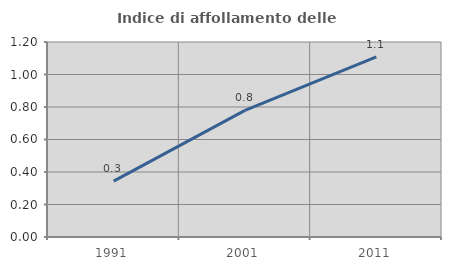
| Category | Indice di affollamento delle abitazioni  |
|---|---|
| 1991.0 | 0.344 |
| 2001.0 | 0.779 |
| 2011.0 | 1.108 |